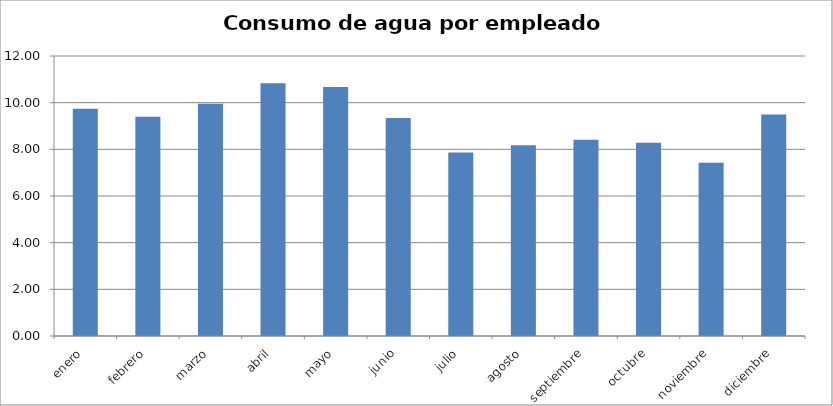
| Category | Series 0 |
|---|---|
| enero | 9.734 |
| febrero | 9.396 |
| marzo | 9.958 |
| abril | 10.828 |
| mayo | 10.667 |
| junio | 9.339 |
| julio | 7.865 |
| agosto | 8.172 |
| septiembre | 8.411 |
| octubre | 8.281 |
| noviembre | 7.427 |
| diciembre | 9.495 |